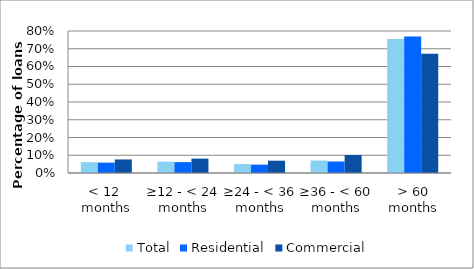
| Category | Total | Residential | Commercial |
|---|---|---|---|
| < 12  months | 0.061 | 0.058 | 0.076 |
| ≥12 - < 24 months | 0.064 | 0.061 | 0.081 |
| ≥24 - < 36 months | 0.05 | 0.047 | 0.069 |
| ≥36 - < 60 months | 0.07 | 0.065 | 0.101 |
| > 60 months | 0.755 | 0.768 | 0.672 |